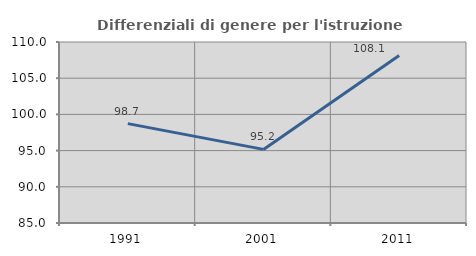
| Category | Differenziali di genere per l'istruzione superiore |
|---|---|
| 1991.0 | 98.724 |
| 2001.0 | 95.167 |
| 2011.0 | 108.138 |